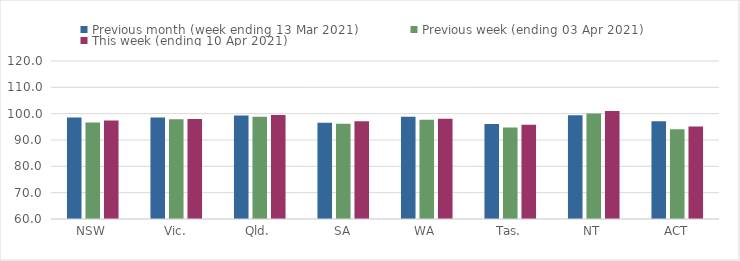
| Category | Previous month (week ending 13 Mar 2021) | Previous week (ending 03 Apr 2021) | This week (ending 10 Apr 2021) |
|---|---|---|---|
| NSW | 98.58 | 96.61 | 97.44 |
| Vic. | 98.51 | 97.88 | 98.02 |
| Qld. | 99.34 | 98.8 | 99.52 |
| SA | 96.52 | 96.16 | 97.15 |
| WA | 98.8 | 97.73 | 98.07 |
| Tas. | 96.11 | 94.73 | 95.81 |
| NT | 99.43 | 100.09 | 101.05 |
| ACT | 97.09 | 94.08 | 95.17 |